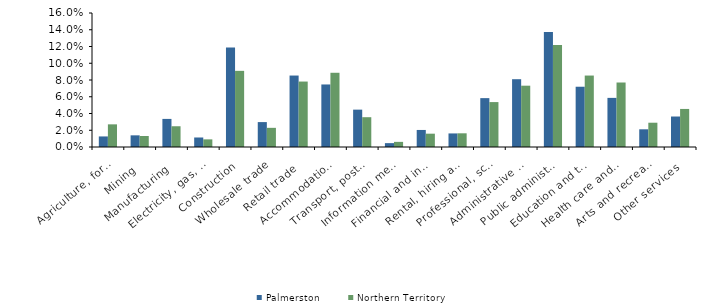
| Category | Palmerston | Northern Territory |
|---|---|---|
| Agriculture, forestry and fishing | 0.013 | 0.027 |
| Mining | 0.014 | 0.013 |
| Manufacturing | 0.034 | 0.025 |
| Electricity, gas, water and waste services | 0.011 | 0.009 |
| Construction | 0.119 | 0.091 |
| Wholesale trade | 0.03 | 0.023 |
| Retail trade | 0.085 | 0.078 |
| Accommodation and food services | 0.075 | 0.089 |
| Transport, postal and warehousing | 0.045 | 0.036 |
| Information media and telecommunications | 0.005 | 0.006 |
| Financial and insurance services | 0.02 | 0.016 |
| Rental, hiring and real estate services | 0.016 | 0.016 |
| Professional, scientific and technical services | 0.058 | 0.054 |
| Administrative and support services | 0.081 | 0.073 |
| Public administration and safety | 0.137 | 0.122 |
| Education and training | 0.072 | 0.085 |
| Health care and social assistance | 0.059 | 0.077 |
| Arts and recreation services | 0.021 | 0.029 |
| Other services | 0.036 | 0.045 |